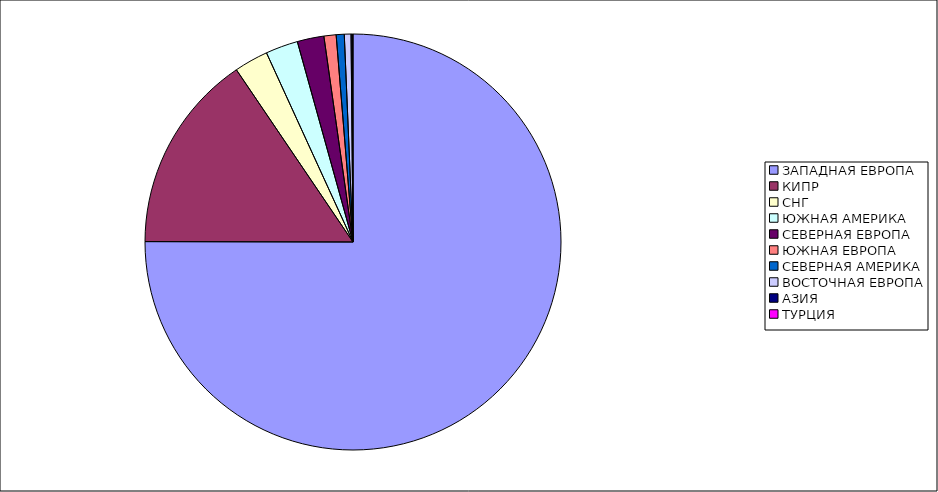
| Category | Оборот |
|---|---|
| ЗАПАДНАЯ ЕВРОПА | 0.75 |
| КИПР | 0.155 |
| СНГ | 0.026 |
| ЮЖНАЯ АМЕРИКА | 0.025 |
| СЕВЕРНАЯ ЕВРОПА | 0.021 |
| ЮЖНАЯ ЕВРОПА | 0.009 |
| СЕВЕРНАЯ АМЕРИКА | 0.006 |
| ВОСТОЧНАЯ ЕВРОПА | 0.005 |
| АЗИЯ | 0.001 |
| ТУРЦИЯ | 0.001 |